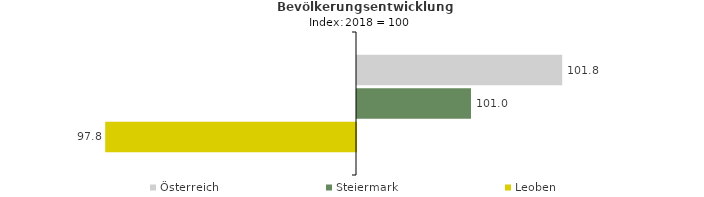
| Category | Österreich | Steiermark | Leoben |
|---|---|---|---|
| 2022.0 | 101.8 | 101 | 97.8 |